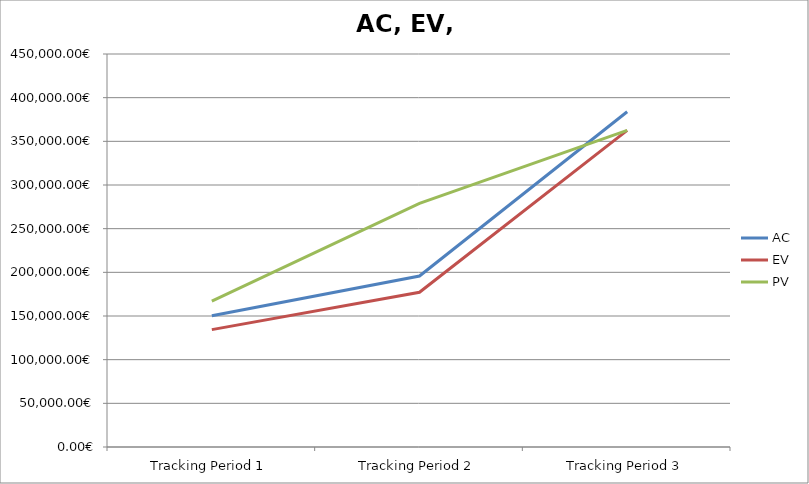
| Category | AC | EV | PV |
|---|---|---|---|
| Tracking Period 1 | 150373 | 134379 | 167133 |
| Tracking Period 2 | 195767 | 177192 | 279072 |
| Tracking Period 3 | 383871 | 362476 | 362476 |